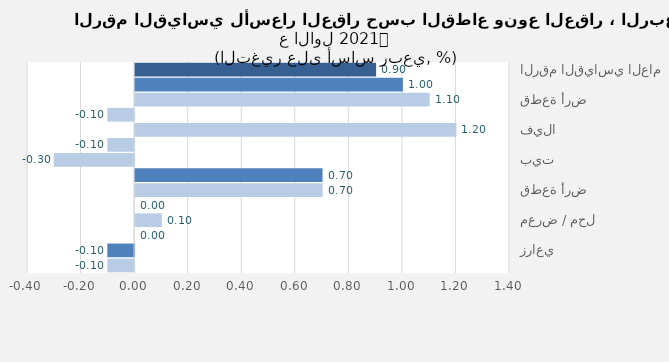
| Category | Series 0 |
|---|---|
| الرقم القياسي العام | 0.9 |
| سكني | 1 |
| قطعة أرض | 1.1 |
| عمارة | -0.1 |
| فيلا | 1.2 |
| شقة | -0.1 |
| بيت | -0.3 |
| تجاري | 0.7 |
| قطعة أرض | 0.7 |
| عمارة | 0 |
| معرض / محل | 0.1 |
| مركز تجاري | 0 |
| زراعي | -0.1 |
| ارض زراعية | -0.1 |